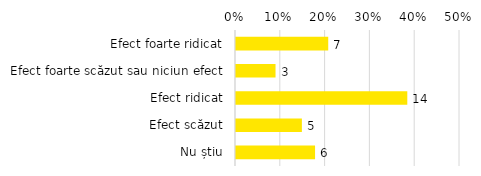
| Category | Total |
|---|---|
| Efect foarte ridicat | 0.206 |
| Efect foarte scăzut sau niciun efect | 0.088 |
| Efect ridicat | 0.382 |
| Efect scăzut | 0.147 |
| Nu știu | 0.176 |